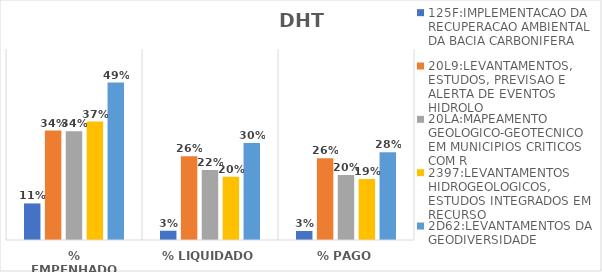
| Category | 125F:IMPLEMENTACAO DA RECUPERACAO AMBIENTAL DA BACIA CARBONIFERA | 20L9:LEVANTAMENTOS, ESTUDOS, PREVISAO E ALERTA DE EVENTOS HIDROLO | 20LA:MAPEAMENTO GEOLOGICO-GEOTECNICO EM MUNICIPIOS CRITICOS COM R | 2397:LEVANTAMENTOS HIDROGEOLOGICOS, ESTUDOS INTEGRADOS EM RECURSO | 2D62:LEVANTAMENTOS DA GEODIVERSIDADE |
|---|---|---|---|---|---|
| % EMPENHADO | 0.115 | 0.344 | 0.342 | 0.372 | 0.495 |
| % LIQUIDADO | 0.029 | 0.263 | 0.22 | 0.199 | 0.305 |
| % PAGO | 0.028 | 0.257 | 0.204 | 0.192 | 0.275 |